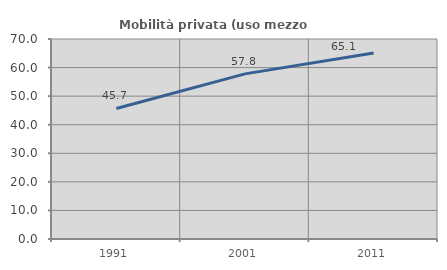
| Category | Mobilità privata (uso mezzo privato) |
|---|---|
| 1991.0 | 45.695 |
| 2001.0 | 57.79 |
| 2011.0 | 65.086 |